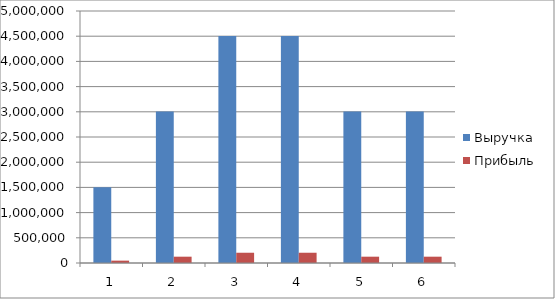
| Category | Выручка | Прибыль |
|---|---|---|
| 0 | 1502000 | 46986.651 |
| 1 | 3004000 | 125289.968 |
| 2 | 4506000 | 203593.286 |
| 3 | 4506000 | 203593.286 |
| 4 | 3004000 | 125289.968 |
| 5 | 3004000 | 125289.968 |